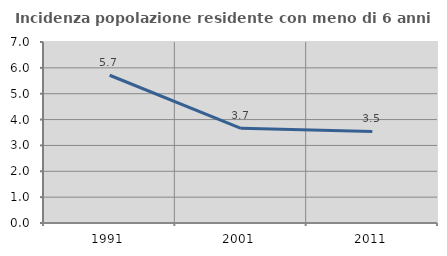
| Category | Incidenza popolazione residente con meno di 6 anni |
|---|---|
| 1991.0 | 5.714 |
| 2001.0 | 3.66 |
| 2011.0 | 3.541 |